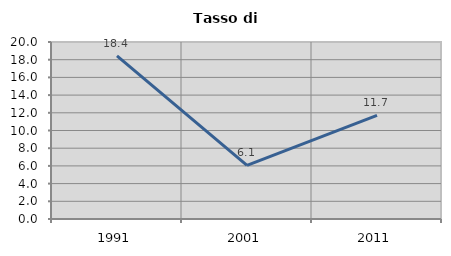
| Category | Tasso di disoccupazione   |
|---|---|
| 1991.0 | 18.432 |
| 2001.0 | 6.061 |
| 2011.0 | 11.718 |